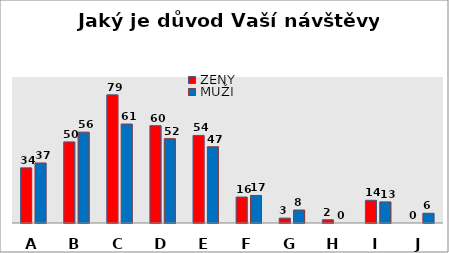
| Category | ŽENY | MUŽI |
|---|---|---|
| A | 34 | 37 |
| B | 50 | 56 |
| C | 79 | 61 |
| D | 60 | 52 |
| E | 54 | 47 |
| F | 16 | 17 |
| G | 3 | 8 |
| H | 2 | 0 |
| I | 14 | 13 |
| J | 0 | 6 |